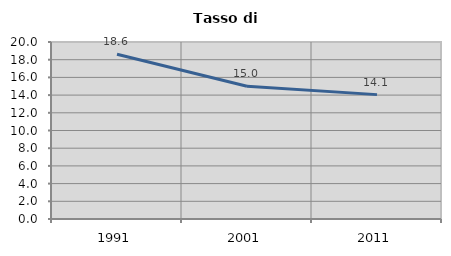
| Category | Tasso di disoccupazione   |
|---|---|
| 1991.0 | 18.625 |
| 2001.0 | 14.997 |
| 2011.0 | 14.053 |